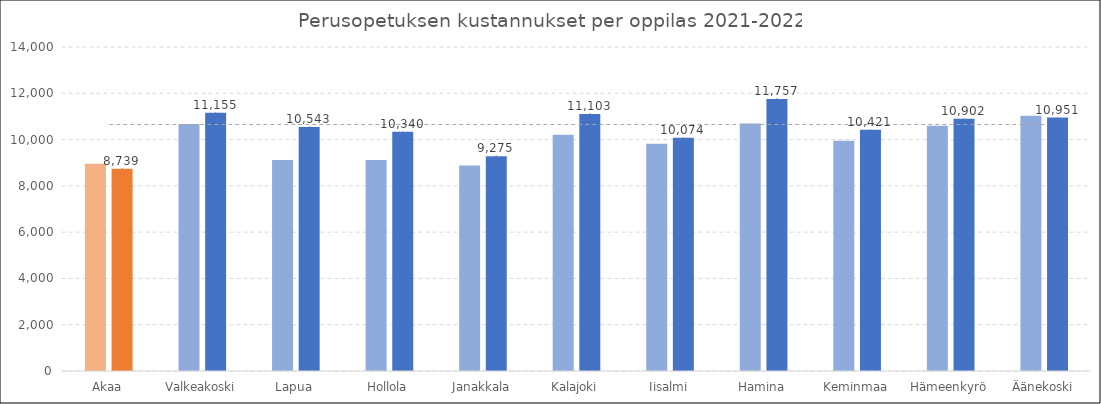
| Category | 2020 | 2021 |
|---|---|---|
| Akaa | 8954.657 | 8739.309 |
| Valkeakoski | 10672.49 | 11154.703 |
| Lapua | 9118.706 | 10543.176 |
| Hollola | 9118.706 | 10340.203 |
| Janakkala | 8875.597 | 9274.67 |
| Kalajoki | 10204.024 | 11103.399 |
| Iisalmi | 9814.31 | 10074.475 |
| Hamina | 10699.474 | 11756.962 |
| Keminmaa | 9947.845 | 10420.73 |
| Hämeenkyrö | 10593.516 | 10901.812 |
| Äänekoski | 11024.832 | 10950.959 |